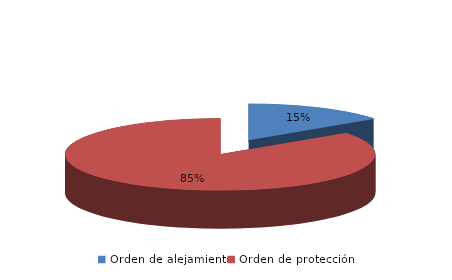
| Category | Series 0 |
|---|---|
| Orden de alejamiento | 51 |
| Orden de protección | 292 |